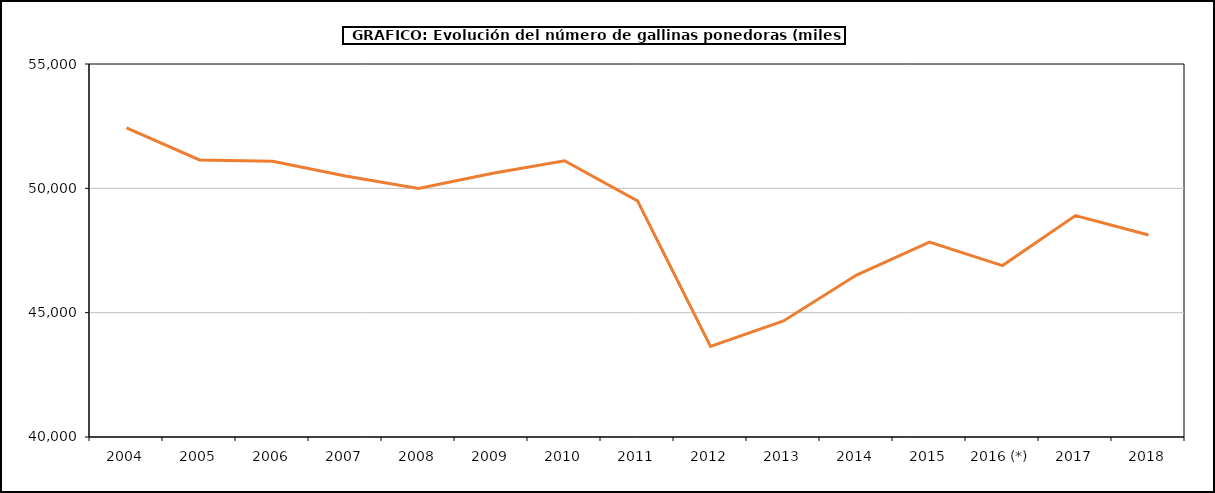
| Category | Series 1 |
|---|---|
| 2004 | 52432.67 |
| 2005 | 51141.084 |
| 2006 | 51089.874 |
| 2007 | 50494.963 |
| 2008 | 49994.952 |
| 2009 | 50593.247 |
| 2010 | 51108 |
| 2011 | 49494.204 |
| 2012 | 43642.944 |
| 2013 | 44667.904 |
| 2014 | 46512.999 |
| 2015 | 47835.268 |
| 2016 (*) | 46894 |
| 2017 | 48904.099 |
| 2018 | 48121.599 |